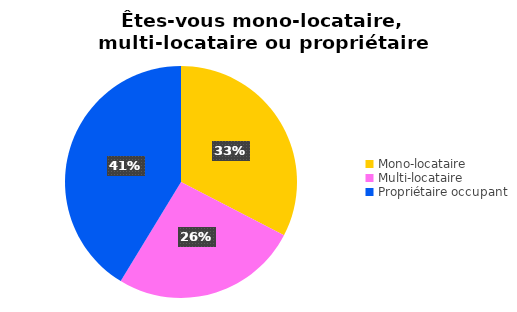
| Category | Series 0 |
|---|---|
| Mono-locataire | 15 |
| Multi-locataire | 12 |
| Propriétaire occupant | 19 |